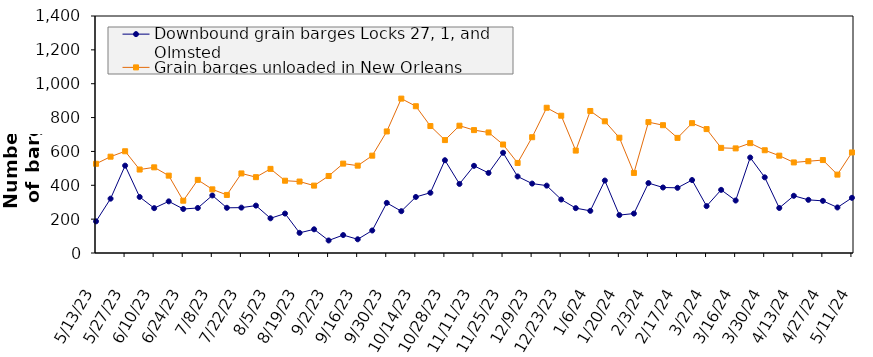
| Category | Downbound grain barges Locks 27, 1, and Olmsted | Grain barges unloaded in New Orleans  |
|---|---|---|
| 5/13/23 | 187 | 527 |
| 5/20/23 | 321 | 569 |
| 5/27/23 | 516 | 601 |
| 6/3/23 | 331 | 493 |
| 6/10/23 | 265 | 506 |
| 6/17/23 | 305 | 457 |
| 6/24/23 | 260 | 309 |
| 7/1/23 | 266 | 432 |
| 7/8/23 | 340 | 376 |
| 7/15/23 | 267 | 343 |
| 7/22/23 | 268 | 470 |
| 7/29/23 | 280 | 448 |
| 8/5/23 | 205 | 497 |
| 8/12/23 | 233 | 427 |
| 8/19/23 | 119 | 422 |
| 8/26/23 | 140 | 398 |
| 9/2/23 | 74 | 455 |
| 9/9/23 | 106 | 528 |
| 9/16/23 | 81 | 516 |
| 9/23/23 | 133 | 575 |
| 9/30/23 | 296 | 718 |
| 10/7/23 | 247 | 912 |
| 10/14/23 | 331 | 867 |
| 10/21/23 | 356 | 750 |
| 10/28/23 | 548 | 667 |
| 11/4/23 | 408 | 752 |
| 11/11/23 | 515 | 726 |
| 11/18/23 | 473 | 712 |
| 11/25/23 | 592 | 641 |
| 12/2/23 | 452 | 532 |
| 12/9/23 | 410 | 684 |
| 12/16/23 | 398 | 858 |
| 12/23/23 | 316 | 811 |
| 12/30/23 | 265 | 605 |
| 1/6/24 | 249 | 839 |
| 1/13/24 | 428 | 778 |
| 1/20/24 | 224 | 681 |
| 1/27/24 | 233 | 473 |
| 2/3/24 | 413 | 773 |
| 2/10/24 | 387 | 755 |
| 2/17/24 | 385 | 680 |
| 2/24/24 | 431 | 767 |
| 3/2/24 | 277 | 732 |
| 3/9/24 | 373 | 621 |
| 3/16/24 | 310 | 618 |
| 3/23/24 | 564 | 649 |
| 3/30/24 | 447 | 607 |
| 4/6/24 | 266 | 575 |
| 4/13/24 | 338 | 535 |
| 4/20/24 | 314 | 542 |
| 4/27/24 | 308 | 549 |
| 5/4/24 | 269 | 463 |
| 5/11/24 | 326 | 594 |